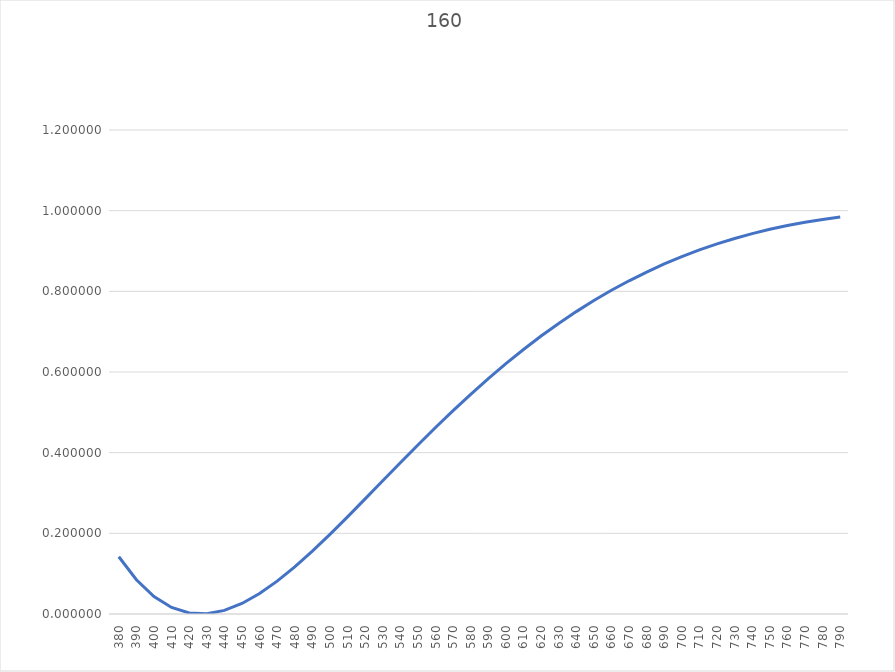
| Category | 160 |
|---|---|
| 380.0 | 0.142 |
| 390.0 | 0.085 |
| 400.0 | 0.043 |
| 410.0 | 0.016 |
| 420.0 | 0.003 |
| 430.0 | 0.001 |
| 440.0 | 0.009 |
| 450.0 | 0.026 |
| 460.0 | 0.051 |
| 470.0 | 0.081 |
| 480.0 | 0.117 |
| 490.0 | 0.156 |
| 500.0 | 0.197 |
| 510.0 | 0.241 |
| 520.0 | 0.285 |
| 530.0 | 0.33 |
| 540.0 | 0.375 |
| 550.0 | 0.419 |
| 560.0 | 0.462 |
| 570.0 | 0.504 |
| 580.0 | 0.545 |
| 590.0 | 0.584 |
| 600.0 | 0.621 |
| 610.0 | 0.656 |
| 620.0 | 0.689 |
| 630.0 | 0.72 |
| 640.0 | 0.75 |
| 650.0 | 0.777 |
| 660.0 | 0.803 |
| 670.0 | 0.826 |
| 680.0 | 0.848 |
| 690.0 | 0.868 |
| 700.0 | 0.886 |
| 710.0 | 0.903 |
| 720.0 | 0.918 |
| 730.0 | 0.931 |
| 740.0 | 0.943 |
| 750.0 | 0.954 |
| 760.0 | 0.963 |
| 770.0 | 0.971 |
| 780.0 | 0.978 |
| 790.0 | 0.984 |